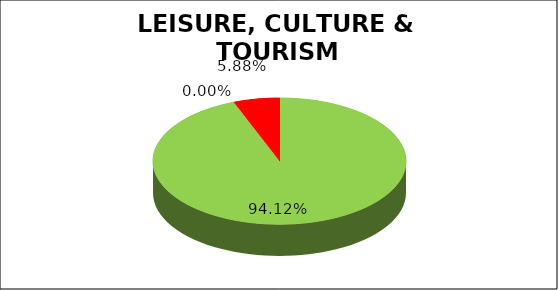
| Category | Q3 |
|---|---|
| Green | 0.941 |
| Amber | 0 |
| Red | 0.059 |